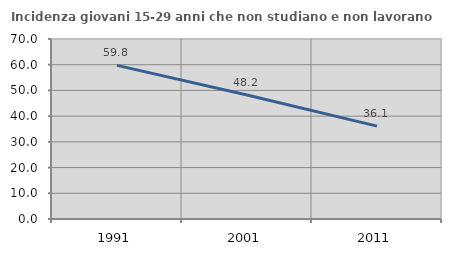
| Category | Incidenza giovani 15-29 anni che non studiano e non lavorano  |
|---|---|
| 1991.0 | 59.756 |
| 2001.0 | 48.222 |
| 2011.0 | 36.115 |